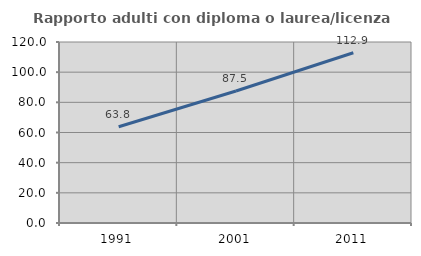
| Category | Rapporto adulti con diploma o laurea/licenza media  |
|---|---|
| 1991.0 | 63.78 |
| 2001.0 | 87.542 |
| 2011.0 | 112.86 |